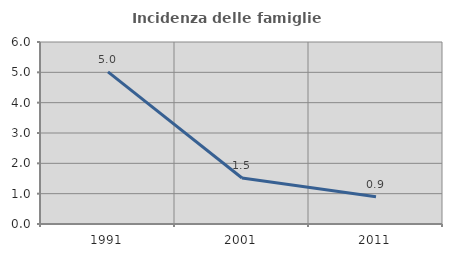
| Category | Incidenza delle famiglie numerose |
|---|---|
| 1991.0 | 5.015 |
| 2001.0 | 1.518 |
| 2011.0 | 0.9 |